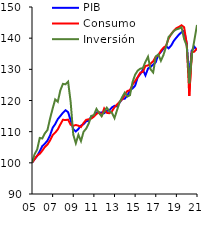
| Category | PIB | Consumo | Inversión |
|---|---|---|---|
| 2005-03-31 | 100 | 100 | 100 |
| 2005-06-30 | 101.183 | 101.168 | 102.773 |
| 2005-09-30 | 102.178 | 102.318 | 104.258 |
| 2005-12-31 | 103.705 | 102.87 | 107.981 |
| 2006-03-31 | 105.373 | 103.915 | 107.809 |
| 2006-06-30 | 106.151 | 105.097 | 109.475 |
| 2006-09-30 | 107.135 | 105.892 | 110.536 |
| 2006-12-31 | 108.824 | 107.174 | 114.197 |
| 2007-03-31 | 111.216 | 108.874 | 117.378 |
| 2007-06-30 | 112.428 | 109.692 | 120.354 |
| 2007-09-30 | 114.03 | 110.723 | 119.578 |
| 2007-12-31 | 115.027 | 112.332 | 123.284 |
| 2008-03-31 | 116.071 | 113.834 | 125.354 |
| 2008-06-30 | 116.892 | 113.718 | 125.19 |
| 2008-09-30 | 116.254 | 113.868 | 126.054 |
| 2008-12-31 | 113.628 | 112.209 | 119.483 |
| 2009-03-31 | 110.812 | 111.877 | 109.068 |
| 2009-06-30 | 110.059 | 112.14 | 106.284 |
| 2009-09-30 | 110.855 | 111.906 | 109.002 |
| 2009-12-31 | 111.954 | 111.513 | 106.977 |
| 2010-03-31 | 112.392 | 112.774 | 109.969 |
| 2010-06-30 | 113.318 | 113.799 | 110.961 |
| 2010-09-30 | 113.506 | 113.962 | 112.578 |
| 2010-12-31 | 114.885 | 114.206 | 115.046 |
| 2011-03-31 | 115.083 | 114.815 | 115.333 |
| 2011-06-30 | 116.158 | 115.663 | 117.298 |
| 2011-09-30 | 115.95 | 116.242 | 116 |
| 2011-12-31 | 116.197 | 115.13 | 114.961 |
| 2012-03-31 | 115.939 | 117.436 | 116.45 |
| 2012-06-30 | 116.666 | 116.042 | 117.693 |
| 2012-09-30 | 116.838 | 115.916 | 116.587 |
| 2012-12-31 | 117.775 | 116.527 | 116.053 |
| 2013-03-31 | 118.293 | 117.841 | 114.35 |
| 2013-06-30 | 118.091 | 118.701 | 116.947 |
| 2013-09-30 | 119.36 | 119.598 | 119.486 |
| 2013-12-31 | 120.488 | 120.376 | 121.116 |
| 2014-03-31 | 120.584 | 121.857 | 122.544 |
| 2014-06-30 | 121.636 | 123.064 | 121.252 |
| 2014-09-30 | 123.287 | 123.299 | 121.704 |
| 2014-12-31 | 123.888 | 125.081 | 125.922 |
| 2015-03-31 | 124.748 | 126.262 | 128.274 |
| 2015-06-30 | 127.431 | 127.474 | 129.586 |
| 2015-09-30 | 128.484 | 128.94 | 130.22 |
| 2015-12-31 | 129.887 | 129.179 | 130.387 |
| 2016-03-31 | 128.054 | 131.085 | 132.422 |
| 2016-06-30 | 130.248 | 131.248 | 134.036 |
| 2016-09-30 | 130.792 | 131.837 | 129.994 |
| 2016-12-31 | 131.526 | 132.592 | 128.993 |
| 2017-03-31 | 132.295 | 134.056 | 134.1 |
| 2017-06-30 | 134.702 | 134.513 | 134.79 |
| 2017-09-30 | 135.559 | 135.948 | 132.744 |
| 2017-12-31 | 136.66 | 136.947 | 134.619 |
| 2018-03-31 | 137.43 | 137.529 | 137.287 |
| 2018-06-30 | 136.731 | 139.899 | 140.41 |
| 2018-09-30 | 137.643 | 141.319 | 141.255 |
| 2018-12-31 | 139.132 | 142.371 | 142.31 |
| 2019-03-31 | 140.167 | 143.19 | 142.814 |
| 2019-06-30 | 141.15 | 143.613 | 143.065 |
| 2019-09-30 | 141.903 | 144.135 | 143.49 |
| 2019-12-31 | 142.367 | 143.513 | 139.723 |
| 2020-03-31 | 138.322 | 138.383 | 137.626 |
| 2020-06-30 | 127.312 | 121.423 | 125.523 |
| 2020-09-30 | 135.992 | 135.463 | 134.766 |
| 2020-12-31 | 137.223 | 135.671 | 139.455 |
| 2021-03-31 | 136.145 | 136.783 | 144.245 |